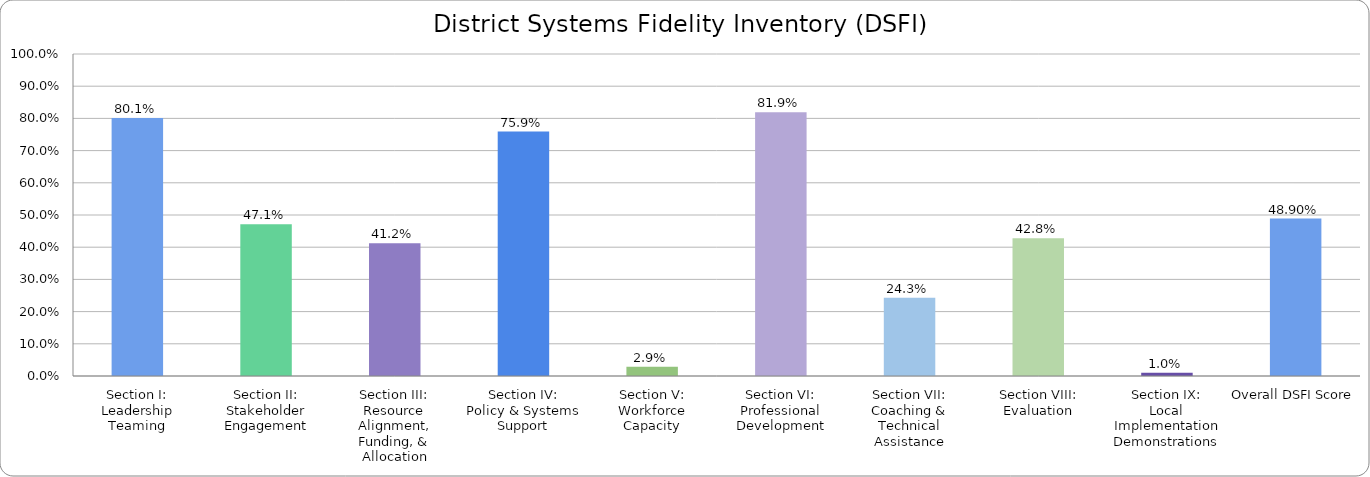
| Category | Series 0 |
|---|---|
| Section I:
Leadership Teaming | 0.801 |
| Section II:
Stakeholder Engagement | 0.471 |
| Section III:
Resource Alignment, Funding, & Allocation | 0.412 |
| Section IV:
Policy & Systems Support | 0.759 |
| Section V:
Workforce Capacity | 0.029 |
| Section VI:
Professional Development | 0.819 |
| Section VII:
Coaching & Technical Assistance | 0.243 |
| Section VIII:
Evaluation | 0.428 |
| Section IX:
Local Implementation Demonstrations | 0.01 |
| Overall DSFI Score | 0.489 |